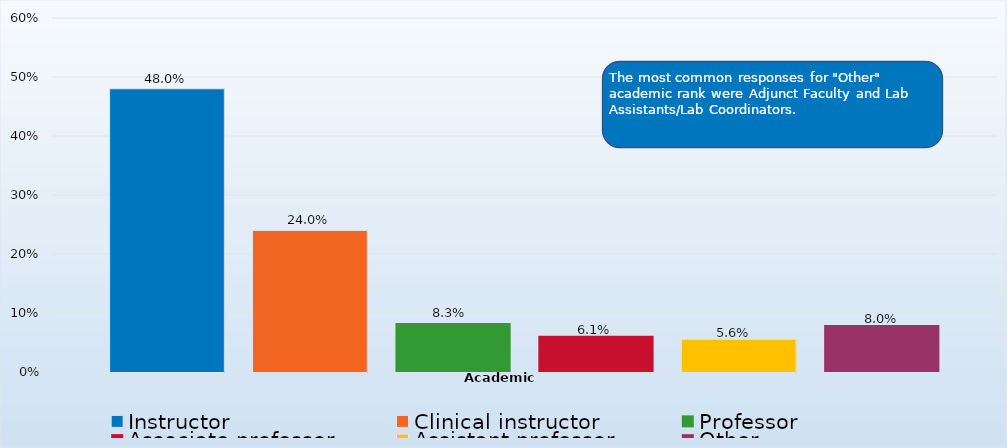
| Category | Instructor | Clinical instructor | Professor | Associate professor | Assistant professor | Other |
|---|---|---|---|---|---|---|
| 0 | 0.48 | 0.24 | 0.083 | 0.061 | 0.056 | 0.08 |